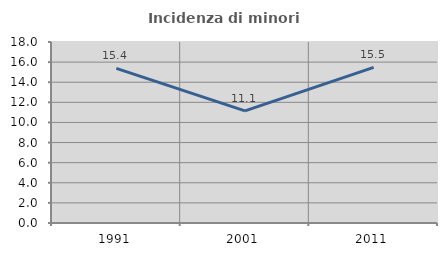
| Category | Incidenza di minori stranieri |
|---|---|
| 1991.0 | 15.385 |
| 2001.0 | 11.149 |
| 2011.0 | 15.478 |